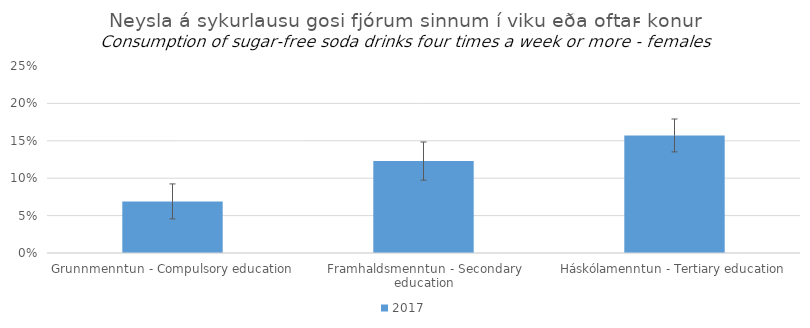
| Category | 2017 |
|---|---|
| Grunnmenntun - Compulsory education | 0.069 |
| Framhaldsmenntun - Secondary education | 0.123 |
| Háskólamenntun - Tertiary education | 0.157 |